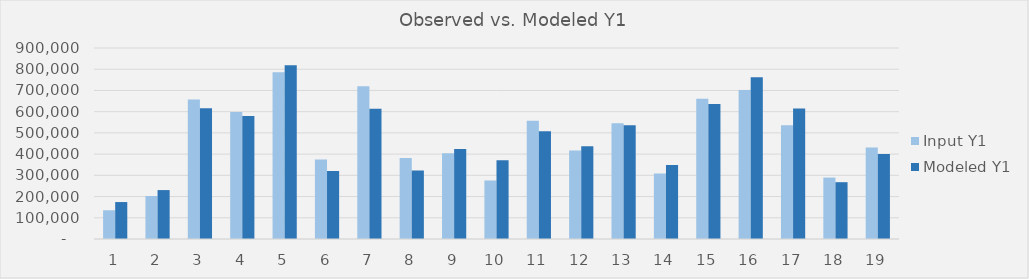
| Category | Input Y1 | Modeled Y1 |
|---|---|---|
| 1.0 | 135437 | 174078.667 |
| 2.0 | 202750 | 230532.911 |
| 3.0 | 656910 | 616518.851 |
| 4.0 | 598518 | 579832.723 |
| 5.0 | 785859 | 818929.064 |
| 6.0 | 374682 | 320652.812 |
| 7.0 | 719357 | 613760.993 |
| 8.0 | 381170 | 323225.626 |
| 9.0 | 403878 | 424281.242 |
| 10.0 | 275740 | 370786.731 |
| 11.0 | 557157 | 507225.275 |
| 12.0 | 416854 | 437330.237 |
| 13.0 | 544992 | 536574.591 |
| 14.0 | 308991 | 348219.587 |
| 15.0 | 660965 | 635646.275 |
| 16.0 | 702326 | 761987.289 |
| 17.0 | 536071 | 615311.823 |
| 18.0 | 289527 | 267700.774 |
| 19.0 | 431452 | 400040.529 |